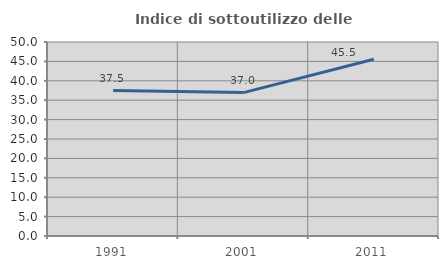
| Category | Indice di sottoutilizzo delle abitazioni  |
|---|---|
| 1991.0 | 37.5 |
| 2001.0 | 36.957 |
| 2011.0 | 45.545 |